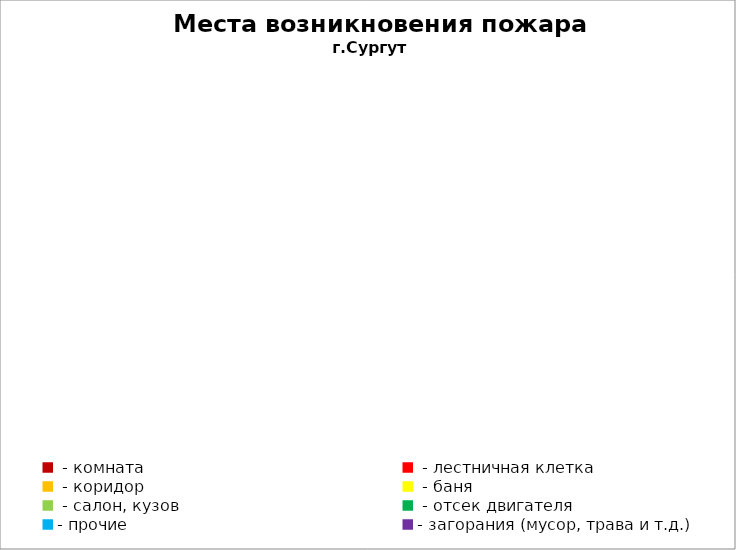
| Category | Места возникновения пожара |
|---|---|
|  - комната | 29 |
|  - лестничная клетка | 3 |
|  - коридор | 7 |
|  - баня | 7 |
|  - салон, кузов | 11 |
|  - отсек двигателя | 28 |
| - прочие | 84 |
| - загорания (мусор, трава и т.д.)  | 78 |